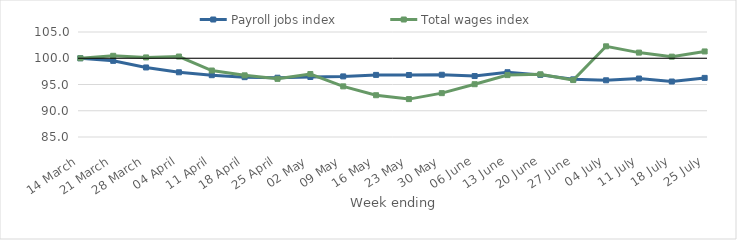
| Category | Payroll jobs index | Total wages index |
|---|---|---|
| 2020-03-14 | 100 | 100 |
| 2020-03-21 | 99.504 | 100.464 |
| 2020-03-28 | 98.246 | 100.157 |
| 2020-04-04 | 97.327 | 100.327 |
| 2020-04-11 | 96.772 | 97.663 |
| 2020-04-18 | 96.396 | 96.746 |
| 2020-04-25 | 96.295 | 96.074 |
| 2020-05-02 | 96.431 | 96.992 |
| 2020-05-09 | 96.542 | 94.647 |
| 2020-05-16 | 96.829 | 92.957 |
| 2020-05-23 | 96.811 | 92.217 |
| 2020-05-30 | 96.856 | 93.352 |
| 2020-06-06 | 96.613 | 95.054 |
| 2020-06-13 | 97.338 | 96.789 |
| 2020-06-20 | 96.834 | 96.941 |
| 2020-06-27 | 95.981 | 95.843 |
| 2020-07-04 | 95.801 | 102.272 |
| 2020-07-11 | 96.139 | 101.075 |
| 2020-07-18 | 95.568 | 100.305 |
| 2020-07-25 | 96.258 | 101.296 |